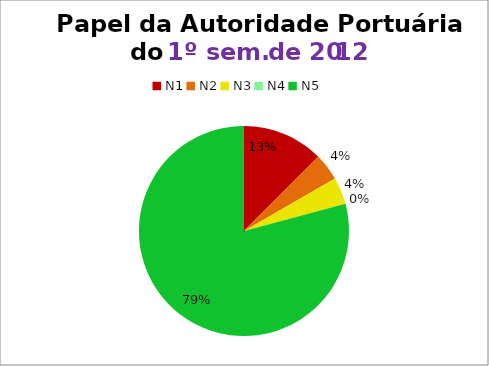
| Category | 1º/12 |
|---|---|
| N1 | 3 |
| N2 | 1 |
| N3 | 1 |
| N4 | 0 |
| N5 | 19 |